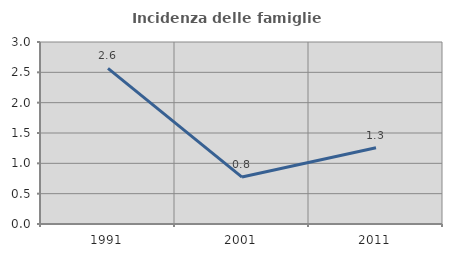
| Category | Incidenza delle famiglie numerose |
|---|---|
| 1991.0 | 2.564 |
| 2001.0 | 0.774 |
| 2011.0 | 1.257 |